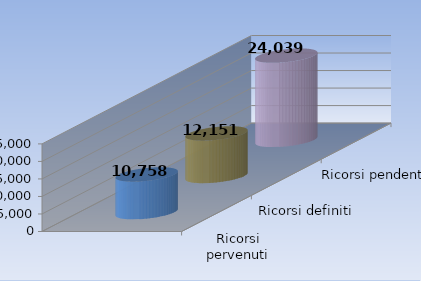
| Category | Ricorsi pervenuti | Ricorsi definiti | Ricorsi pendenti |
|---|---|---|---|
| 0 | 10758 | 12151 | 24039 |